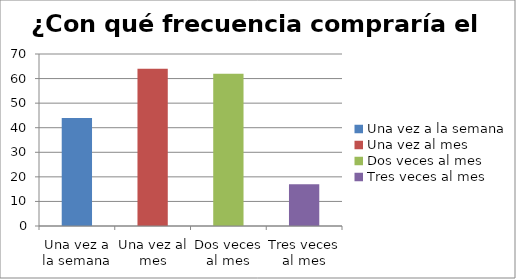
| Category | ¿Con qué frecuencia compraría el Aceite? |
|---|---|
| Una vez a la semana | 44 |
| Una vez al mes | 64 |
| Dos veces al mes | 62 |
| Tres veces al mes | 17 |